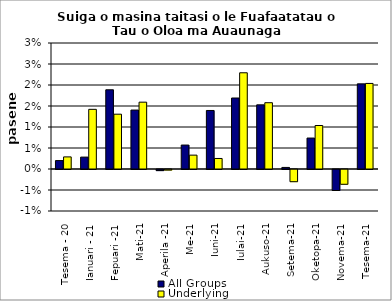
| Category | All Groups | Underlying |
|---|---|---|
| Tesema - 20 | 0.002 | 0.003 |
| Ianuari - 21 | 0.003 | 0.014 |
| Fepuari -21 | 0.019 | 0.013 |
| Mati-21 | 0.014 | 0.016 |
| Aperila -21 | 0 | 0 |
| Me-21 | 0.006 | 0.003 |
| Iuni-21 | 0.014 | 0.003 |
| Iulai-21 | 0.017 | 0.023 |
| Aukuso-21 | 0.015 | 0.016 |
| Setema-21 | 0 | -0.003 |
| Oketopa-21 | 0.007 | 0.01 |
| Novema-21 | -0.005 | -0.004 |
| Tesema-21 | 0.02 | 0.02 |